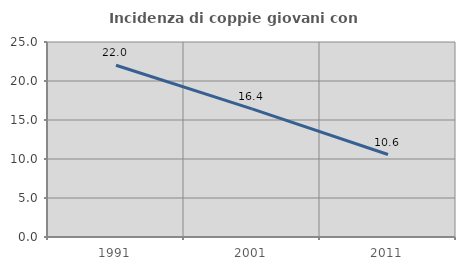
| Category | Incidenza di coppie giovani con figli |
|---|---|
| 1991.0 | 22.016 |
| 2001.0 | 16.427 |
| 2011.0 | 10.573 |